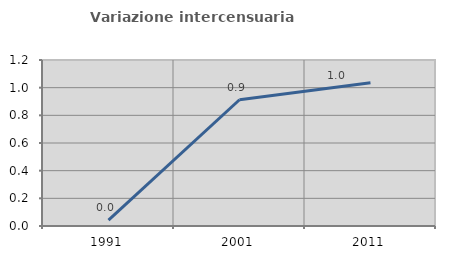
| Category | Variazione intercensuaria annua |
|---|---|
| 1991.0 | 0.043 |
| 2001.0 | 0.913 |
| 2011.0 | 1.035 |